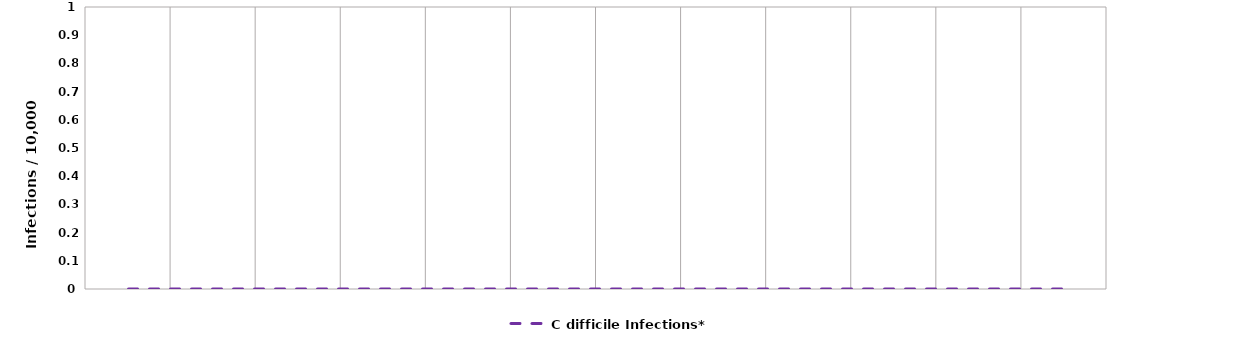
| Category | C difficile Infections* |
|---|---|
| Jan | 0 |
| Feb | 0 |
| Mar | 0 |
| Apr | 0 |
| May | 0 |
| Jun | 0 |
| Jul | 0 |
| Aug | 0 |
| Sep | 0 |
| Oct | 0 |
| Nov | 0 |
| Dec | 0 |